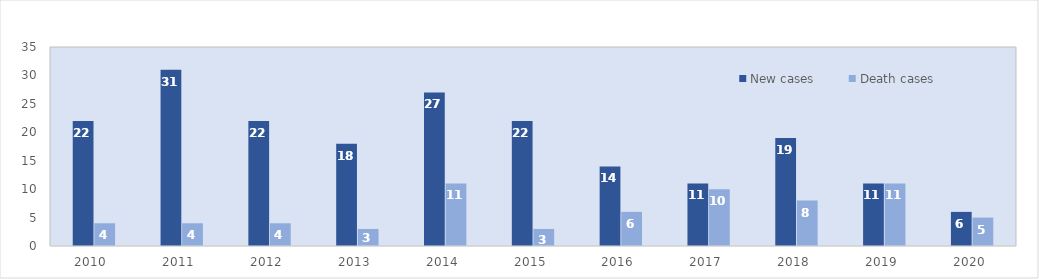
| Category | New cases | Death cases |
|---|---|---|
| 2010.0 | 22 | 4 |
| 2011.0 | 31 | 4 |
| 2012.0 | 22 | 4 |
| 2013.0 | 18 | 3 |
| 2014.0 | 27 | 11 |
| 2015.0 | 22 | 3 |
| 2016.0 | 14 | 6 |
| 2017.0 | 11 | 10 |
| 2018.0 | 19 | 8 |
| 2019.0 | 11 | 11 |
| 2020.0 | 6 | 5 |